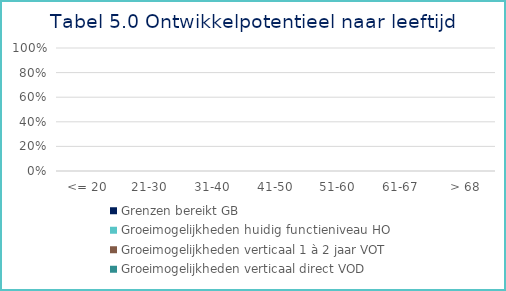
| Category | Grenzen bereikt | Groeimogelijkheden huidig functieniveau | Groeimogelijkheden verticaal 1 à 2 jaar | Groeimogelijkheden verticaal direct |
|---|---|---|---|---|
|  <= 20 | 0 | 0 | 0 | 0 |
| 21-30 | 0 | 0 | 0 | 0 |
| 31-40 | 0 | 0 | 0 | 0 |
| 41-50 | 0 | 0 | 0 | 0 |
| 51-60 | 0 | 0 | 0 | 0 |
| 61-67 | 0 | 0 | 0 | 0 |
|  > 68 | 0 | 0 | 0 | 0 |